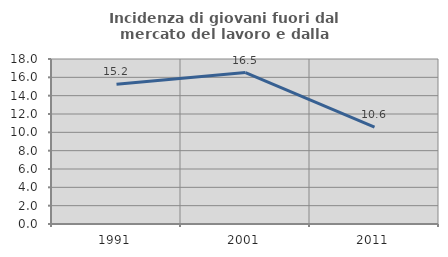
| Category | Incidenza di giovani fuori dal mercato del lavoro e dalla formazione  |
|---|---|
| 1991.0 | 15.244 |
| 2001.0 | 16.516 |
| 2011.0 | 10.569 |